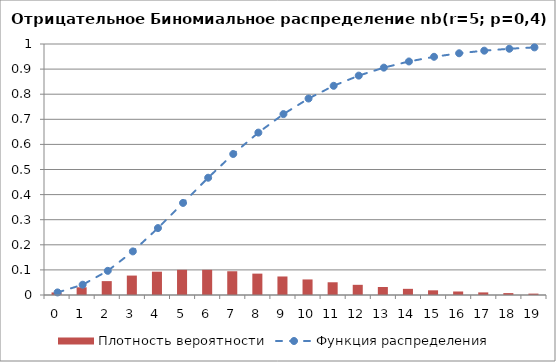
| Category | Плотность вероятности |
|---|---|
| 0.0 | 0.01 |
| 1.0 | 0.031 |
| 2.0 | 0.055 |
| 3.0 | 0.077 |
| 4.0 | 0.093 |
| 5.0 | 0.1 |
| 6.0 | 0.1 |
| 7.0 | 0.095 |
| 8.0 | 0.085 |
| 9.0 | 0.074 |
| 10.0 | 0.062 |
| 11.0 | 0.051 |
| 12.0 | 0.041 |
| 13.0 | 0.032 |
| 14.0 | 0.025 |
| 15.0 | 0.019 |
| 16.0 | 0.014 |
| 17.0 | 0.01 |
| 18.0 | 0.008 |
| 19.0 | 0.006 |